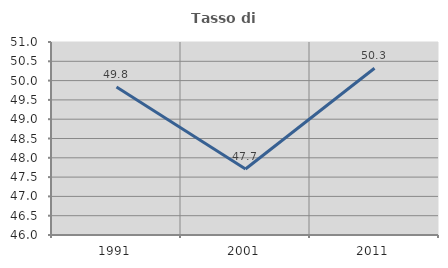
| Category | Tasso di occupazione   |
|---|---|
| 1991.0 | 49.832 |
| 2001.0 | 47.709 |
| 2011.0 | 50.32 |